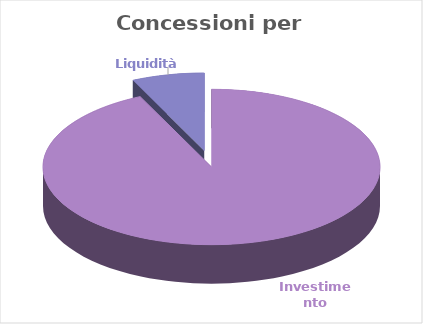
| Category | Series 0 |
|---|---|
| Investimento | 23787654 |
| Liquidità  | 1780000 |